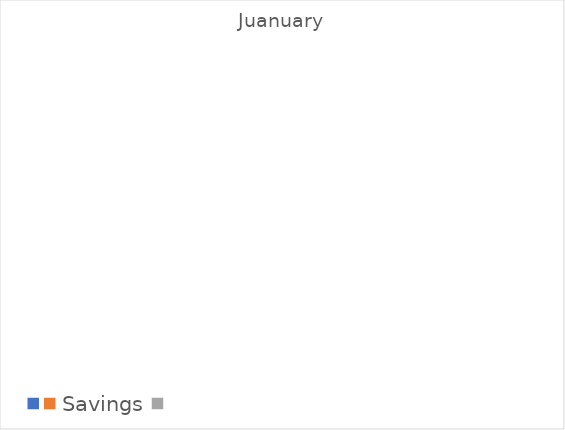
| Category | Juanuary | February | March | April | May | June | July | August | September | October | November | December |
|---|---|---|---|---|---|---|---|---|---|---|---|---|
| Savings | 0 | 0 | 0 | 0 | 0 | 0 | 0 | 0 | 0 | 0 | 0 | 0 |
| Fixed Expenses | 0 | 0 | 0 | 0 | 0 | 0 | 0 | 0 | 0 | 0 | 0 | 0 |
| Other Expensese | 0 | 0 | 0 | 0 | 0 | 0 | 0 | 0 | 0 | 0 | 0 | 0 |